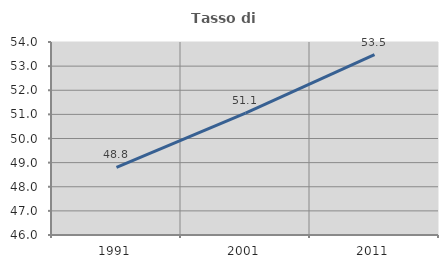
| Category | Tasso di occupazione   |
|---|---|
| 1991.0 | 48.802 |
| 2001.0 | 51.053 |
| 2011.0 | 53.476 |